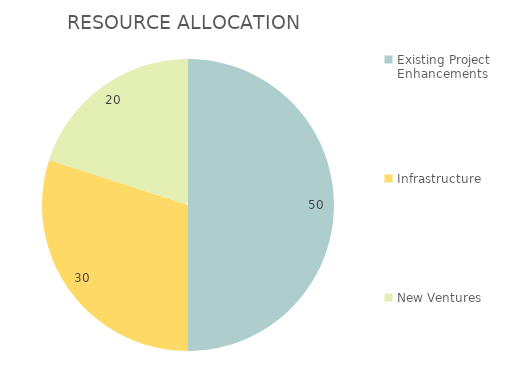
| Category | Series 0 |
|---|---|
| Existing Project Enhancements | 50 |
| Infrastructure | 30 |
| New Ventures | 20 |